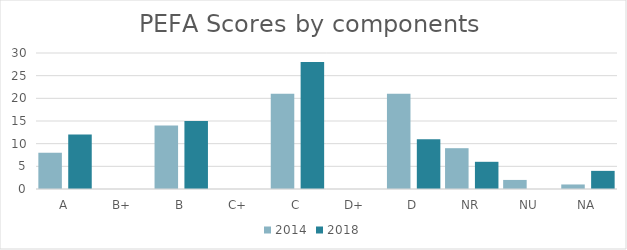
| Category | 2014 | 2018 |
|---|---|---|
| A | 8 | 12 |
| B+ | 0 | 0 |
| B | 14 | 15 |
| C+ | 0 | 0 |
| C | 21 | 28 |
| D+ | 0 | 0 |
| D | 21 | 11 |
| NR | 9 | 6 |
| NU | 2 | 0 |
| NA | 1 | 4 |